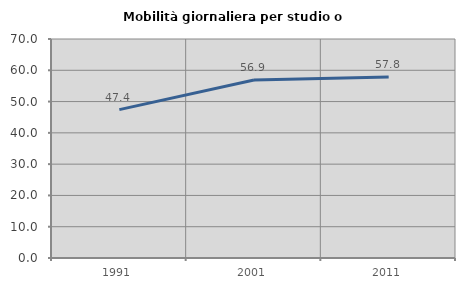
| Category | Mobilità giornaliera per studio o lavoro |
|---|---|
| 1991.0 | 47.433 |
| 2001.0 | 56.882 |
| 2011.0 | 57.823 |